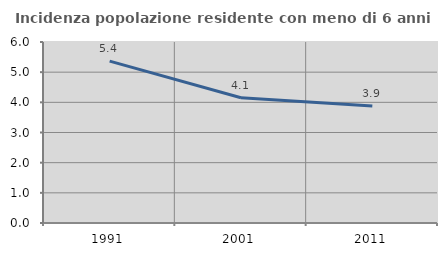
| Category | Incidenza popolazione residente con meno di 6 anni |
|---|---|
| 1991.0 | 5.365 |
| 2001.0 | 4.15 |
| 2011.0 | 3.88 |